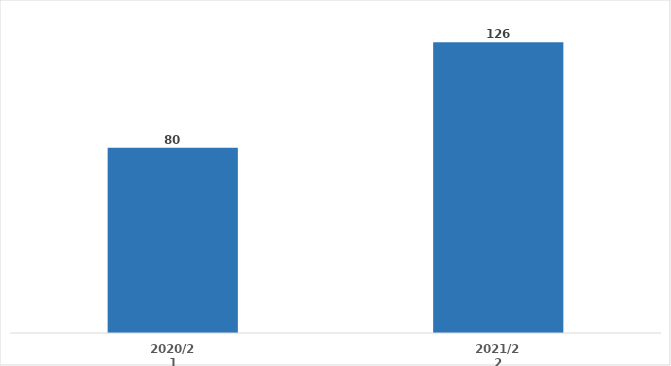
| Category | Series 0 |
|---|---|
| 2020/21 | 80.25 |
| 2021/22 | 126 |